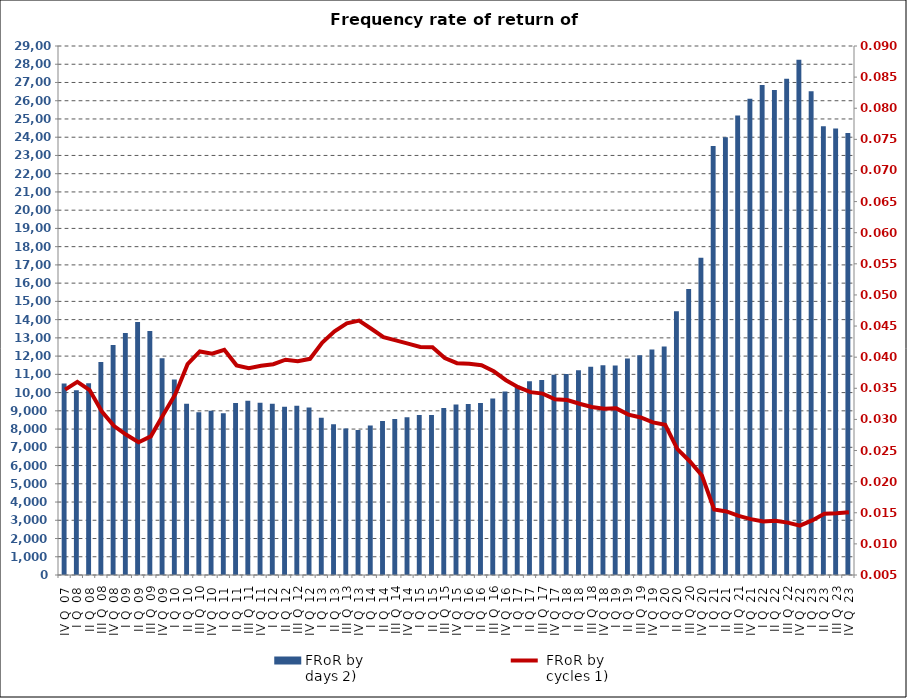
| Category | FRoR by 
days 2) |
|---|---|
| IV Q  07 | 10491.876 |
| I Q  08 | 10127.197 |
| II Q  08 | 10512.864 |
| III Q  08 | 11671.936 |
| IV Q  08 | 12611.836 |
| I Q  09 | 13260.408 |
| II Q  09 | 13868.06 |
| III Q  09 | 13381.347 |
| IV Q  09 | 11883.56 |
| I Q  10 | 10717.946 |
| II Q  10 | 9390.312 |
| III Q  10 | 8920.023 |
| IV Q  10 | 8999.68 |
| I Q  11 | 8860.681 |
| II Q  11 | 9434.733 |
| III Q  11 | 9545.864 |
| IV Q  11 | 9449.084 |
| I Q  12 | 9389.736 |
| II Q  12 | 9217.635 |
| III Q  12 | 9273.259 |
| IV Q  12 | 9185.587 |
| I Q  13 | 8618.667 |
| II Q  13 | 8265.801 |
| III Q  13 | 8031.674 |
| IV Q  13 | 7955.696 |
| I Q  14 | 8189.844 |
| II Q  14 | 8444.051 |
| III Q  14 | 8546.063 |
| IV Q  14 | 8652.607 |
| I Q  15 | 8766.39 |
| II Q  15 | 8775.541 |
| III Q  15 | 9157.205 |
| IV Q  15 | 9349.249 |
| I Q  16 | 9371.049 |
| II Q  16 | 9432.745 |
| III Q  16 | 9675.077 |
| IV Q  16 | 10056.096 |
| I Q  17 | 10373.433 |
| II Q  17 | 10616.203 |
| III Q  17 | 10690.234 |
| IV Q  17 | 10982.963 |
| I Q  18 | 11022.304 |
| II Q  18 | 11224.636 |
| III Q  18 | 11411.384 |
| IV Q  18 | 11504.028 |
| I Q  19 | 11487.295 |
| II Q  19 | 11862.846 |
| III Q  19 | 12041.92 |
| IV Q  19 | 12360.982 |
| I Q  20 | 12528.203 |
| II Q  20 | 14464.543 |
| III Q  20 | 15677.85 |
| IV Q  20 | 17385.621 |
| I Q  21 | 23513.238 |
| II Q  21 | 23996.829 |
| III Q  21 | 25190.242 |
| IV Q  21 | 26107.278 |
| I Q  22 | 26856.907 |
| II Q  22 | 26585.017 |
| III Q  22 | 27209.406 |
| IV Q  22 | 28243.903 |
| I Q  23 | 26515.923 |
| II Q  23 | 24600.326 |
| III Q  23 | 24472.74 |
| IV Q  23 | 24227.688 |